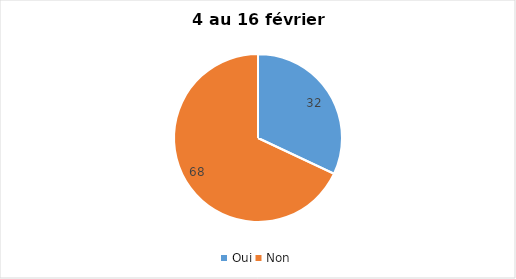
| Category | Series 0 |
|---|---|
| Oui | 32 |
| Non | 68 |